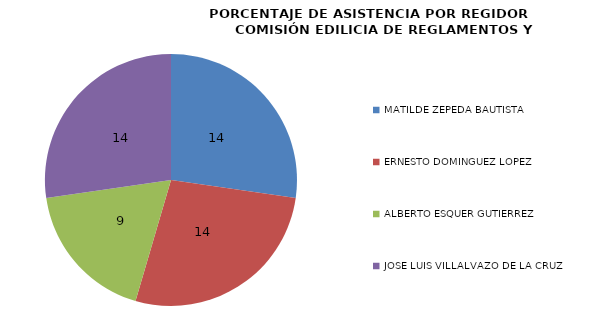
| Category | Series 0 |
|---|---|
| MATILDE ZEPEDA BAUTISTA | 13.636 |
| ERNESTO DOMINGUEZ LOPEZ  | 13.636 |
| ALBERTO ESQUER GUTIERREZ | 9.091 |
| JOSE LUIS VILLALVAZO DE LA CRUZ  | 13.636 |